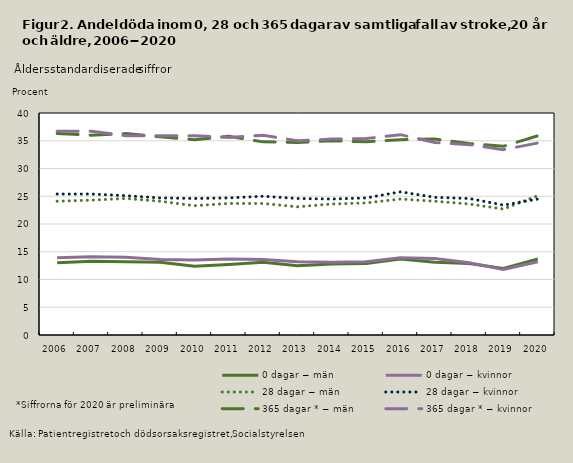
| Category | 0 dagar − män | 0 dagar − kvinnor | 28 dagar − män | 28 dagar − kvinnor | 365 dagar * − män | 365 dagar * − kvinnor |
|---|---|---|---|---|---|---|
| 2006.0 | 13 | 13.9 | 24.1 | 25.4 | 36.3 | 36.7 |
| 2007.0 | 13.3 | 14.1 | 24.3 | 25.4 | 36 | 36.7 |
| 2008.0 | 13.2 | 14 | 24.6 | 25.1 | 36.3 | 35.9 |
| 2009.0 | 13.1 | 13.6 | 24.1 | 24.7 | 35.7 | 35.9 |
| 2010.0 | 12.4 | 13.5 | 23.3 | 24.6 | 35.2 | 35.9 |
| 2011.0 | 12.7 | 13.7 | 23.7 | 24.7 | 35.8 | 35.6 |
| 2012.0 | 13.1 | 13.6 | 23.7 | 25 | 34.8 | 36 |
| 2013.0 | 12.5 | 13.2 | 23.1 | 24.6 | 34.7 | 35 |
| 2014.0 | 12.8 | 13.1 | 23.6 | 24.5 | 35 | 35.3 |
| 2015.0 | 12.9 | 13.2 | 23.8 | 24.7 | 34.8 | 35.4 |
| 2016.0 | 13.7 | 13.9 | 24.5 | 25.8 | 35.2 | 36.1 |
| 2017.0 | 13.1 | 13.8 | 24.1 | 24.8 | 35.3 | 34.7 |
| 2018.0 | 12.9 | 13 | 23.6 | 24.6 | 34.5 | 34.3 |
| 2019.0 | 12 | 11.8 | 22.7 | 23.4 | 34 | 33.4 |
| 2020.0 | 13.7 | 13.2 | 25.1 | 24.5 | 35.9 | 34.6 |